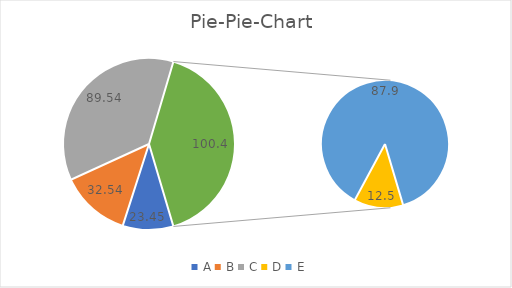
| Category | Pie-Pie-Chart |
|---|---|
| A | 23.45 |
| B | 32.54 |
| C | 89.54 |
| D | 12.5 |
| E | 87.9 |